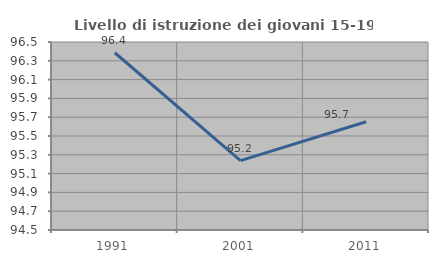
| Category | Livello di istruzione dei giovani 15-19 anni |
|---|---|
| 1991.0 | 96.386 |
| 2001.0 | 95.238 |
| 2011.0 | 95.652 |